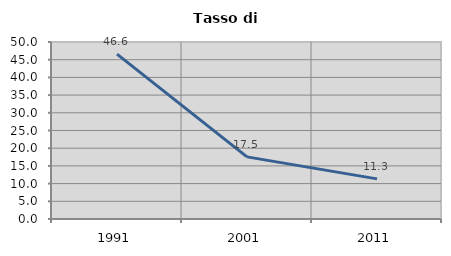
| Category | Tasso di disoccupazione   |
|---|---|
| 1991.0 | 46.559 |
| 2001.0 | 17.547 |
| 2011.0 | 11.332 |